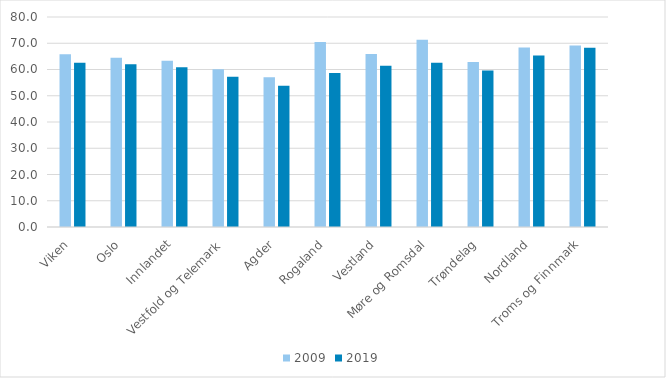
| Category | 2009 | 2019 |
|---|---|---|
| Viken | 65.83 | 62.572 |
| Oslo | 64.5 | 62 |
| Innlandet | 63.321 | 60.86 |
| Vestfold og Telemark | 60.104 | 57.242 |
| Agder | 57.024 | 53.805 |
| Rogaland | 70.5 | 58.7 |
| Vestland | 65.931 | 61.449 |
| Møre og Romsdal | 71.3 | 62.6 |
| Trøndelag | 62.821 | 59.6 |
| Nordland | 68.4 | 65.3 |
| Troms og Finnmark | 69.134 | 68.316 |